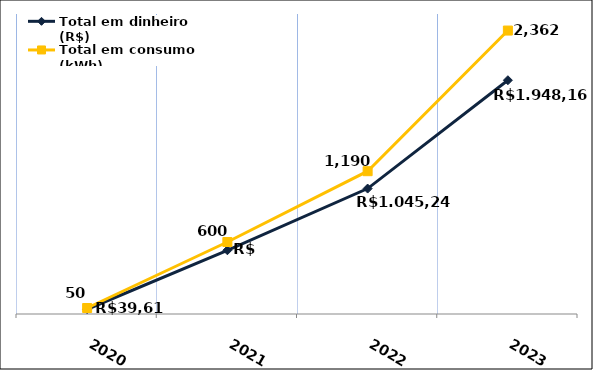
| Category | Total em dinheiro (R$) |
|---|---|
| 2020.0 | 39.61 |
| 2021.0 | 531.07 |
| 2022.0 | 1045.24 |
| 2023.0 | 1948.16 |